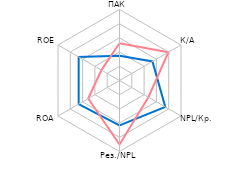
| Category | Србија | Регион |
|---|---|---|
| ПАК | 1.746 | 2.621 |
| К/А | 2.678 | 3.976 |
| NPL/Кр. | 3.725 | 2.351 |
| Рез./NPL | 3.162 | 4.506 |
| ROA | 3.32 | 2.54 |
| ROE | 3.32 | 1.468 |